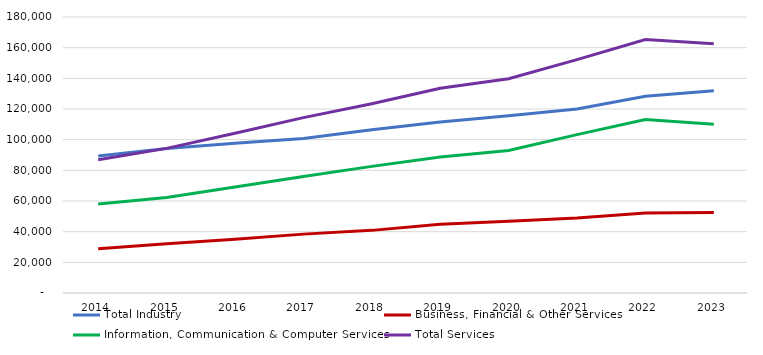
| Category | Total Industry | Business, Financial & Other Services | Information, Communication & Computer Services | Total Services |
|---|---|---|---|---|
| 2014 | 89310 | 28861 | 58011 | 86872 |
| 2015 | 94204 | 32060 | 62266 | 94326 |
| 2016 | 97679 | 35048 | 69112 | 104160 |
| 2017 | 100790 | 38398 | 75973 | 114371 |
| 2018 | 106425 | 40845 | 82588 | 123433 |
| 2019 | 111457 | 44848 | 88631 | 133479 |
| 2020 | 115648 | 46829 | 92927 | 139756 |
| 2021 | 119953 | 48901 | 103309 | 152210 |
| 2022 | 128340 | 52143 | 113170 | 165313 |
| 2023 | 131909 | 52506 | 110056 | 162562 |